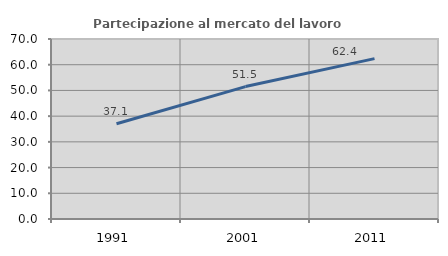
| Category | Partecipazione al mercato del lavoro  femminile |
|---|---|
| 1991.0 | 37.067 |
| 2001.0 | 51.501 |
| 2011.0 | 62.37 |